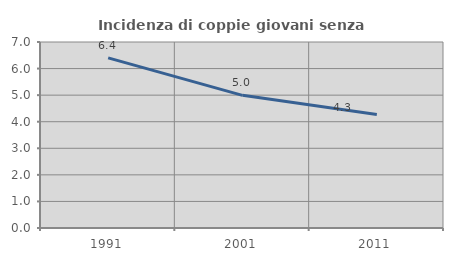
| Category | Incidenza di coppie giovani senza figli |
|---|---|
| 1991.0 | 6.404 |
| 2001.0 | 4.992 |
| 2011.0 | 4.273 |